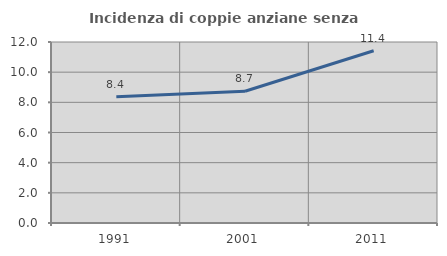
| Category | Incidenza di coppie anziane senza figli  |
|---|---|
| 1991.0 | 8.362 |
| 2001.0 | 8.733 |
| 2011.0 | 11.416 |